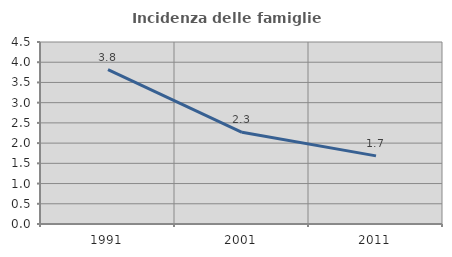
| Category | Incidenza delle famiglie numerose |
|---|---|
| 1991.0 | 3.818 |
| 2001.0 | 2.266 |
| 2011.0 | 1.684 |